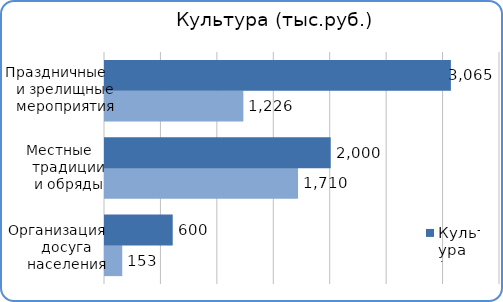
| Category | Факт | План  |
|---|---|---|
| Досуг населения | 152800 | 600000 |
| Местные традиции и обряды | 1710400 | 2000000 |
| Праздничные и зрелищные мероприятия | 1226000 | 3064800 |